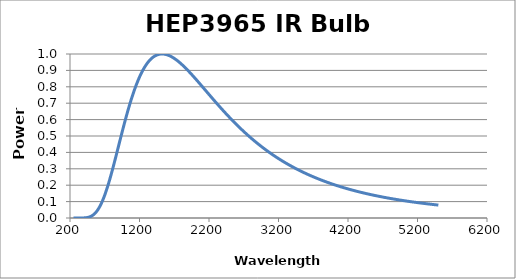
| Category | Power (a.u.) |
|---|---|
| 250.0 | 0 |
| 260.0 | 0 |
| 270.0 | 0 |
| 280.0 | 0 |
| 290.0 | 0 |
| 300.0 | 0 |
| 310.0 | 0 |
| 320.0 | 0 |
| 330.0 | 0 |
| 340.0 | 0 |
| 350.0 | 0 |
| 360.0 | 0 |
| 370.0 | 0 |
| 380.0 | 0 |
| 390.0 | 0 |
| 400.0 | 0.001 |
| 410.0 | 0.001 |
| 420.0 | 0.001 |
| 430.0 | 0.002 |
| 440.0 | 0.002 |
| 450.0 | 0.003 |
| 460.0 | 0.004 |
| 470.0 | 0.005 |
| 480.0 | 0.006 |
| 490.0 | 0.008 |
| 500.0 | 0.01 |
| 510.0 | 0.012 |
| 520.0 | 0.015 |
| 530.0 | 0.018 |
| 540.0 | 0.021 |
| 550.0 | 0.024 |
| 560.0 | 0.029 |
| 570.0 | 0.033 |
| 580.0 | 0.038 |
| 590.0 | 0.044 |
| 600.0 | 0.05 |
| 610.0 | 0.056 |
| 620.0 | 0.064 |
| 630.0 | 0.071 |
| 640.0 | 0.079 |
| 650.0 | 0.088 |
| 660.0 | 0.098 |
| 670.0 | 0.107 |
| 680.0 | 0.118 |
| 690.0 | 0.129 |
| 700.0 | 0.14 |
| 710.0 | 0.152 |
| 720.0 | 0.164 |
| 730.0 | 0.177 |
| 740.0 | 0.19 |
| 750.0 | 0.204 |
| 760.0 | 0.218 |
| 770.0 | 0.232 |
| 780.0 | 0.247 |
| 790.0 | 0.262 |
| 800.0 | 0.278 |
| 810.0 | 0.293 |
| 820.0 | 0.309 |
| 830.0 | 0.325 |
| 840.0 | 0.341 |
| 850.0 | 0.358 |
| 860.0 | 0.374 |
| 870.0 | 0.391 |
| 880.0 | 0.408 |
| 890.0 | 0.424 |
| 900.0 | 0.441 |
| 910.0 | 0.458 |
| 920.0 | 0.475 |
| 930.0 | 0.491 |
| 940.0 | 0.508 |
| 950.0 | 0.524 |
| 960.0 | 0.541 |
| 970.0 | 0.557 |
| 980.0 | 0.573 |
| 990.0 | 0.589 |
| 1000.0 | 0.604 |
| 1010.0 | 0.62 |
| 1020.0 | 0.635 |
| 1030.0 | 0.65 |
| 1040.0 | 0.665 |
| 1050.0 | 0.679 |
| 1060.0 | 0.694 |
| 1070.0 | 0.707 |
| 1080.0 | 0.721 |
| 1090.0 | 0.734 |
| 1100.0 | 0.747 |
| 1110.0 | 0.76 |
| 1120.0 | 0.772 |
| 1130.0 | 0.785 |
| 1140.0 | 0.796 |
| 1150.0 | 0.808 |
| 1160.0 | 0.819 |
| 1170.0 | 0.829 |
| 1180.0 | 0.84 |
| 1190.0 | 0.85 |
| 1200.0 | 0.859 |
| 1210.0 | 0.869 |
| 1220.0 | 0.878 |
| 1230.0 | 0.886 |
| 1240.0 | 0.894 |
| 1250.0 | 0.902 |
| 1260.0 | 0.91 |
| 1270.0 | 0.917 |
| 1280.0 | 0.924 |
| 1290.0 | 0.931 |
| 1300.0 | 0.937 |
| 1310.0 | 0.943 |
| 1320.0 | 0.948 |
| 1330.0 | 0.954 |
| 1340.0 | 0.958 |
| 1350.0 | 0.963 |
| 1360.0 | 0.967 |
| 1370.0 | 0.972 |
| 1380.0 | 0.975 |
| 1390.0 | 0.979 |
| 1400.0 | 0.982 |
| 1410.0 | 0.985 |
| 1420.0 | 0.987 |
| 1430.0 | 0.99 |
| 1440.0 | 0.992 |
| 1450.0 | 0.994 |
| 1460.0 | 0.995 |
| 1470.0 | 0.997 |
| 1480.0 | 0.998 |
| 1490.0 | 0.999 |
| 1500.0 | 0.999 |
| 1510.0 | 1 |
| 1520.0 | 1 |
| 1530.0 | 1 |
| 1540.0 | 1 |
| 1550.0 | 0.999 |
| 1560.0 | 0.999 |
| 1570.0 | 0.998 |
| 1580.0 | 0.997 |
| 1590.0 | 0.996 |
| 1600.0 | 0.995 |
| 1610.0 | 0.993 |
| 1620.0 | 0.991 |
| 1630.0 | 0.99 |
| 1640.0 | 0.988 |
| 1650.0 | 0.986 |
| 1660.0 | 0.983 |
| 1670.0 | 0.981 |
| 1680.0 | 0.978 |
| 1690.0 | 0.976 |
| 1700.0 | 0.973 |
| 1710.0 | 0.97 |
| 1720.0 | 0.967 |
| 1730.0 | 0.964 |
| 1740.0 | 0.961 |
| 1750.0 | 0.958 |
| 1760.0 | 0.954 |
| 1770.0 | 0.951 |
| 1780.0 | 0.947 |
| 1790.0 | 0.943 |
| 1800.0 | 0.94 |
| 1810.0 | 0.936 |
| 1820.0 | 0.932 |
| 1830.0 | 0.928 |
| 1840.0 | 0.924 |
| 1850.0 | 0.92 |
| 1860.0 | 0.915 |
| 1870.0 | 0.911 |
| 1880.0 | 0.907 |
| 1890.0 | 0.903 |
| 1900.0 | 0.898 |
| 1910.0 | 0.894 |
| 1920.0 | 0.889 |
| 1930.0 | 0.885 |
| 1940.0 | 0.88 |
| 1950.0 | 0.875 |
| 1960.0 | 0.871 |
| 1970.0 | 0.866 |
| 1980.0 | 0.861 |
| 1990.0 | 0.857 |
| 2000.0 | 0.852 |
| 2010.0 | 0.847 |
| 2020.0 | 0.842 |
| 2030.0 | 0.837 |
| 2040.0 | 0.832 |
| 2050.0 | 0.828 |
| 2060.0 | 0.823 |
| 2070.0 | 0.818 |
| 2080.0 | 0.813 |
| 2090.0 | 0.808 |
| 2100.0 | 0.803 |
| 2110.0 | 0.798 |
| 2120.0 | 0.793 |
| 2130.0 | 0.788 |
| 2140.0 | 0.783 |
| 2150.0 | 0.778 |
| 2160.0 | 0.773 |
| 2170.0 | 0.768 |
| 2180.0 | 0.763 |
| 2190.0 | 0.758 |
| 2200.0 | 0.753 |
| 2210.0 | 0.748 |
| 2220.0 | 0.743 |
| 2230.0 | 0.739 |
| 2240.0 | 0.734 |
| 2250.0 | 0.729 |
| 2260.0 | 0.724 |
| 2270.0 | 0.719 |
| 2280.0 | 0.714 |
| 2290.0 | 0.709 |
| 2300.0 | 0.704 |
| 2310.0 | 0.7 |
| 2320.0 | 0.695 |
| 2330.0 | 0.69 |
| 2340.0 | 0.685 |
| 2350.0 | 0.68 |
| 2360.0 | 0.676 |
| 2370.0 | 0.671 |
| 2380.0 | 0.666 |
| 2390.0 | 0.661 |
| 2400.0 | 0.657 |
| 2410.0 | 0.652 |
| 2420.0 | 0.648 |
| 2430.0 | 0.643 |
| 2440.0 | 0.638 |
| 2450.0 | 0.634 |
| 2460.0 | 0.629 |
| 2470.0 | 0.625 |
| 2480.0 | 0.62 |
| 2490.0 | 0.616 |
| 2500.0 | 0.611 |
| 2510.0 | 0.607 |
| 2520.0 | 0.602 |
| 2530.0 | 0.598 |
| 2540.0 | 0.594 |
| 2550.0 | 0.589 |
| 2560.0 | 0.585 |
| 2570.0 | 0.581 |
| 2580.0 | 0.576 |
| 2590.0 | 0.572 |
| 2600.0 | 0.568 |
| 2610.0 | 0.564 |
| 2620.0 | 0.56 |
| 2630.0 | 0.556 |
| 2640.0 | 0.551 |
| 2650.0 | 0.547 |
| 2660.0 | 0.543 |
| 2670.0 | 0.539 |
| 2680.0 | 0.535 |
| 2690.0 | 0.531 |
| 2700.0 | 0.527 |
| 2710.0 | 0.523 |
| 2720.0 | 0.52 |
| 2730.0 | 0.516 |
| 2740.0 | 0.512 |
| 2750.0 | 0.508 |
| 2760.0 | 0.504 |
| 2770.0 | 0.5 |
| 2780.0 | 0.497 |
| 2790.0 | 0.493 |
| 2800.0 | 0.489 |
| 2810.0 | 0.486 |
| 2820.0 | 0.482 |
| 2830.0 | 0.478 |
| 2840.0 | 0.475 |
| 2850.0 | 0.471 |
| 2860.0 | 0.468 |
| 2870.0 | 0.464 |
| 2880.0 | 0.461 |
| 2890.0 | 0.457 |
| 2900.0 | 0.454 |
| 2910.0 | 0.451 |
| 2920.0 | 0.447 |
| 2930.0 | 0.444 |
| 2940.0 | 0.44 |
| 2950.0 | 0.437 |
| 2960.0 | 0.434 |
| 2970.0 | 0.431 |
| 2980.0 | 0.427 |
| 2990.0 | 0.424 |
| 3000.0 | 0.421 |
| 3010.0 | 0.418 |
| 3020.0 | 0.415 |
| 3030.0 | 0.412 |
| 3040.0 | 0.409 |
| 3050.0 | 0.405 |
| 3060.0 | 0.402 |
| 3070.0 | 0.399 |
| 3080.0 | 0.396 |
| 3090.0 | 0.394 |
| 3100.0 | 0.391 |
| 3110.0 | 0.388 |
| 3120.0 | 0.385 |
| 3130.0 | 0.382 |
| 3140.0 | 0.379 |
| 3150.0 | 0.376 |
| 3160.0 | 0.373 |
| 3170.0 | 0.371 |
| 3180.0 | 0.368 |
| 3190.0 | 0.365 |
| 3200.0 | 0.362 |
| 3210.0 | 0.36 |
| 3220.0 | 0.357 |
| 3230.0 | 0.354 |
| 3240.0 | 0.352 |
| 3250.0 | 0.349 |
| 3260.0 | 0.347 |
| 3270.0 | 0.344 |
| 3280.0 | 0.341 |
| 3290.0 | 0.339 |
| 3300.0 | 0.336 |
| 3310.0 | 0.334 |
| 3320.0 | 0.331 |
| 3330.0 | 0.329 |
| 3340.0 | 0.327 |
| 3350.0 | 0.324 |
| 3360.0 | 0.322 |
| 3370.0 | 0.319 |
| 3380.0 | 0.317 |
| 3390.0 | 0.315 |
| 3400.0 | 0.312 |
| 3410.0 | 0.31 |
| 3420.0 | 0.308 |
| 3430.0 | 0.306 |
| 3440.0 | 0.303 |
| 3450.0 | 0.301 |
| 3460.0 | 0.299 |
| 3470.0 | 0.297 |
| 3480.0 | 0.295 |
| 3490.0 | 0.292 |
| 3500.0 | 0.29 |
| 3510.0 | 0.288 |
| 3520.0 | 0.286 |
| 3530.0 | 0.284 |
| 3540.0 | 0.282 |
| 3550.0 | 0.28 |
| 3560.0 | 0.278 |
| 3570.0 | 0.276 |
| 3580.0 | 0.274 |
| 3590.0 | 0.272 |
| 3600.0 | 0.27 |
| 3610.0 | 0.268 |
| 3620.0 | 0.266 |
| 3630.0 | 0.264 |
| 3640.0 | 0.262 |
| 3650.0 | 0.26 |
| 3660.0 | 0.259 |
| 3670.0 | 0.257 |
| 3680.0 | 0.255 |
| 3690.0 | 0.253 |
| 3700.0 | 0.251 |
| 3710.0 | 0.249 |
| 3720.0 | 0.248 |
| 3730.0 | 0.246 |
| 3740.0 | 0.244 |
| 3750.0 | 0.242 |
| 3760.0 | 0.241 |
| 3770.0 | 0.239 |
| 3780.0 | 0.237 |
| 3790.0 | 0.236 |
| 3800.0 | 0.234 |
| 3810.0 | 0.232 |
| 3820.0 | 0.231 |
| 3830.0 | 0.229 |
| 3840.0 | 0.227 |
| 3850.0 | 0.226 |
| 3860.0 | 0.224 |
| 3870.0 | 0.223 |
| 3880.0 | 0.221 |
| 3890.0 | 0.22 |
| 3900.0 | 0.218 |
| 3910.0 | 0.217 |
| 3920.0 | 0.215 |
| 3930.0 | 0.214 |
| 3940.0 | 0.212 |
| 3950.0 | 0.211 |
| 3960.0 | 0.209 |
| 3970.0 | 0.208 |
| 3980.0 | 0.206 |
| 3990.0 | 0.205 |
| 4000.0 | 0.203 |
| 4010.0 | 0.202 |
| 4020.0 | 0.201 |
| 4030.0 | 0.199 |
| 4040.0 | 0.198 |
| 4050.0 | 0.196 |
| 4060.0 | 0.195 |
| 4070.0 | 0.194 |
| 4080.0 | 0.192 |
| 4090.0 | 0.191 |
| 4100.0 | 0.19 |
| 4110.0 | 0.189 |
| 4120.0 | 0.187 |
| 4130.0 | 0.186 |
| 4140.0 | 0.185 |
| 4150.0 | 0.183 |
| 4160.0 | 0.182 |
| 4170.0 | 0.181 |
| 4180.0 | 0.18 |
| 4190.0 | 0.179 |
| 4200.0 | 0.177 |
| 4210.0 | 0.176 |
| 4220.0 | 0.175 |
| 4230.0 | 0.174 |
| 4240.0 | 0.173 |
| 4250.0 | 0.171 |
| 4260.0 | 0.17 |
| 4270.0 | 0.169 |
| 4280.0 | 0.168 |
| 4290.0 | 0.167 |
| 4300.0 | 0.166 |
| 4310.0 | 0.165 |
| 4320.0 | 0.164 |
| 4330.0 | 0.163 |
| 4340.0 | 0.161 |
| 4350.0 | 0.16 |
| 4360.0 | 0.159 |
| 4370.0 | 0.158 |
| 4380.0 | 0.157 |
| 4390.0 | 0.156 |
| 4400.0 | 0.155 |
| 4410.0 | 0.154 |
| 4420.0 | 0.153 |
| 4430.0 | 0.152 |
| 4440.0 | 0.151 |
| 4450.0 | 0.15 |
| 4460.0 | 0.149 |
| 4470.0 | 0.148 |
| 4480.0 | 0.147 |
| 4490.0 | 0.146 |
| 4500.0 | 0.145 |
| 4510.0 | 0.144 |
| 4520.0 | 0.143 |
| 4530.0 | 0.142 |
| 4540.0 | 0.142 |
| 4550.0 | 0.141 |
| 4560.0 | 0.14 |
| 4570.0 | 0.139 |
| 4580.0 | 0.138 |
| 4590.0 | 0.137 |
| 4600.0 | 0.136 |
| 4610.0 | 0.135 |
| 4620.0 | 0.134 |
| 4630.0 | 0.134 |
| 4640.0 | 0.133 |
| 4650.0 | 0.132 |
| 4660.0 | 0.131 |
| 4670.0 | 0.13 |
| 4680.0 | 0.129 |
| 4690.0 | 0.129 |
| 4700.0 | 0.128 |
| 4710.0 | 0.127 |
| 4720.0 | 0.126 |
| 4730.0 | 0.125 |
| 4740.0 | 0.125 |
| 4750.0 | 0.124 |
| 4760.0 | 0.123 |
| 4770.0 | 0.122 |
| 4780.0 | 0.121 |
| 4790.0 | 0.121 |
| 4800.0 | 0.12 |
| 4810.0 | 0.119 |
| 4820.0 | 0.118 |
| 4830.0 | 0.118 |
| 4840.0 | 0.117 |
| 4850.0 | 0.116 |
| 4860.0 | 0.116 |
| 4870.0 | 0.115 |
| 4880.0 | 0.114 |
| 4890.0 | 0.113 |
| 4900.0 | 0.113 |
| 4910.0 | 0.112 |
| 4920.0 | 0.111 |
| 4930.0 | 0.111 |
| 4940.0 | 0.11 |
| 4950.0 | 0.109 |
| 4960.0 | 0.109 |
| 4970.0 | 0.108 |
| 4980.0 | 0.107 |
| 4990.0 | 0.107 |
| 5000.0 | 0.106 |
| 5010.0 | 0.105 |
| 5020.0 | 0.105 |
| 5030.0 | 0.104 |
| 5040.0 | 0.103 |
| 5050.0 | 0.103 |
| 5060.0 | 0.102 |
| 5070.0 | 0.102 |
| 5080.0 | 0.101 |
| 5090.0 | 0.1 |
| 5100.0 | 0.1 |
| 5110.0 | 0.099 |
| 5120.0 | 0.099 |
| 5130.0 | 0.098 |
| 5140.0 | 0.097 |
| 5150.0 | 0.097 |
| 5160.0 | 0.096 |
| 5170.0 | 0.096 |
| 5180.0 | 0.095 |
| 5190.0 | 0.094 |
| 5200.0 | 0.094 |
| 5210.0 | 0.093 |
| 5220.0 | 0.093 |
| 5230.0 | 0.092 |
| 5240.0 | 0.092 |
| 5250.0 | 0.091 |
| 5260.0 | 0.091 |
| 5270.0 | 0.09 |
| 5280.0 | 0.09 |
| 5290.0 | 0.089 |
| 5300.0 | 0.088 |
| 5310.0 | 0.088 |
| 5320.0 | 0.087 |
| 5330.0 | 0.087 |
| 5340.0 | 0.086 |
| 5350.0 | 0.086 |
| 5360.0 | 0.085 |
| 5370.0 | 0.085 |
| 5380.0 | 0.084 |
| 5390.0 | 0.084 |
| 5400.0 | 0.083 |
| 5410.0 | 0.083 |
| 5420.0 | 0.083 |
| 5430.0 | 0.082 |
| 5440.0 | 0.082 |
| 5450.0 | 0.081 |
| 5460.0 | 0.081 |
| 5470.0 | 0.08 |
| 5480.0 | 0.08 |
| 5490.0 | 0.079 |
| 5500.0 | 0.079 |